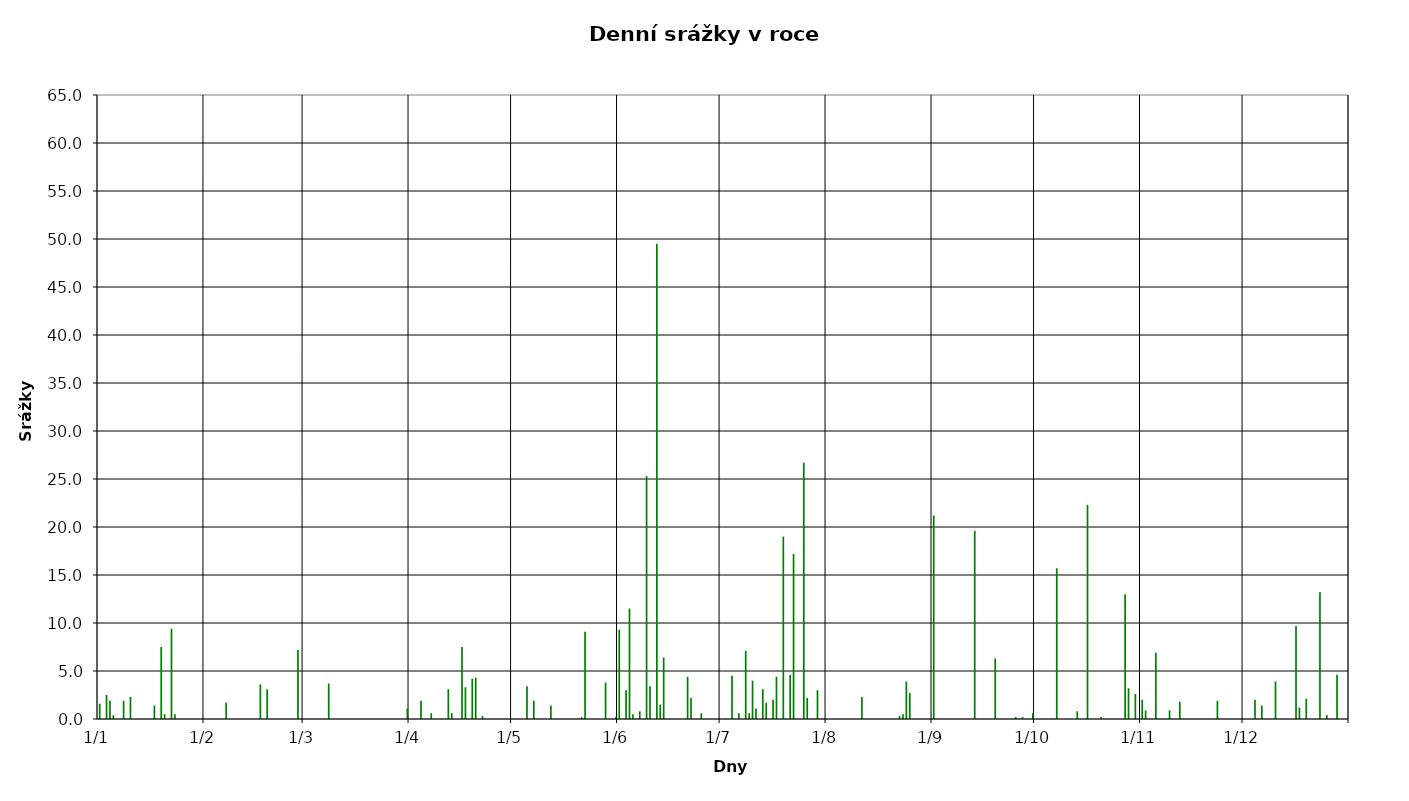
| Category | Series 0 |
|---|---|
| 2012-01-01 | 1.6 |
| 2012-01-02 | 0 |
| 2012-01-03 | 2.5 |
| 2012-01-04 | 1.9 |
| 2012-01-05 | 0.4 |
| 2012-01-06 | 0 |
| 2012-01-07 | 0 |
| 2012-01-08 | 1.9 |
| 2012-01-09 | 0 |
| 2012-01-10 | 2.3 |
| 2012-01-11 | 0 |
| 2012-01-12 | 0 |
| 2012-01-13 | 0 |
| 2012-01-14 | 0 |
| 2012-01-15 | 0 |
| 2012-01-16 | 0 |
| 2012-01-17 | 1.4 |
| 2012-01-18 | 0 |
| 2012-01-19 | 7.5 |
| 2012-01-20 | 0.5 |
| 2012-01-21 | 0 |
| 2012-01-22 | 9.4 |
| 2012-01-23 | 0.5 |
| 2012-01-24 | 0 |
| 2012-01-25 | 0 |
| 2012-01-26 | 0 |
| 2012-01-27 | 0 |
| 2012-01-28 | 0 |
| 2012-01-29 | 0 |
| 2012-01-30 | 0 |
| 2012-01-31 | 0 |
| 2012-02-01 | 0 |
| 2012-02-02 | 0 |
| 2012-02-03 | 0 |
| 2012-02-04 | 0 |
| 2012-02-05 | 0 |
| 2012-02-06 | 0 |
| 2012-02-07 | 1.7 |
| 2012-02-08 | 0 |
| 2012-02-09 | 0 |
| 2012-02-10 | 0 |
| 2012-02-11 | 0 |
| 2012-02-12 | 0 |
| 2012-02-13 | 0 |
| 2012-02-14 | 0 |
| 2012-02-15 | 0 |
| 2012-02-16 | 0 |
| 2012-02-17 | 3.6 |
| 2012-02-18 | 0 |
| 2012-02-19 | 3.1 |
| 2012-02-20 | 0 |
| 2012-02-21 | 0 |
| 2012-02-22 | 0 |
| 2012-02-23 | 0 |
| 2012-02-24 | 0 |
| 2012-02-25 | 0 |
| 2012-02-26 | 0 |
| 2012-02-27 | 0 |
| 2012-02-28 | 7.2 |
| 2012-02-29 | 0 |
| 2012-03-01 | 0 |
| 2012-03-02 | 0 |
| 2012-03-03 | 0 |
| 2012-03-04 | 0 |
| 2012-03-05 | 0 |
| 2012-03-06 | 0 |
| 2012-03-07 | 0 |
| 2012-03-08 | 3.7 |
| 2012-03-09 | 0 |
| 2012-03-10 | 0 |
| 2012-03-11 | 0 |
| 2012-03-12 | 0 |
| 2012-03-13 | 0 |
| 2012-03-14 | 0 |
| 2012-03-15 | 0 |
| 2012-03-16 | 0 |
| 2012-03-17 | 0 |
| 2012-03-18 | 0 |
| 2012-03-19 | 0 |
| 2012-03-20 | 0 |
| 2012-03-21 | 0 |
| 2012-03-22 | 0 |
| 2012-03-23 | 0 |
| 2012-03-24 | 0 |
| 2012-03-25 | 0 |
| 2012-03-26 | 0 |
| 2012-03-27 | 0 |
| 2012-03-28 | 0 |
| 2012-03-29 | 0 |
| 2012-03-30 | 0 |
| 2012-03-31 | 1.1 |
| 2012-04-01 | 0 |
| 2012-04-02 | 0 |
| 2012-04-03 | 0 |
| 2012-04-04 | 1.9 |
| 2012-04-05 | 0 |
| 2012-04-06 | 0 |
| 2012-04-07 | 0.6 |
| 2012-04-08 | 0 |
| 2012-04-09 | 0 |
| 2012-04-10 | 0 |
| 2012-04-11 | 0 |
| 2012-04-12 | 3.1 |
| 2012-04-13 | 0.6 |
| 2012-04-14 | 0 |
| 2012-04-15 | 0 |
| 2012-04-16 | 7.5 |
| 2012-04-17 | 3.3 |
| 2012-04-18 | 0 |
| 2012-04-19 | 4.2 |
| 2012-04-20 | 4.3 |
| 2012-04-21 | 0 |
| 2012-04-22 | 0.3 |
| 2012-04-23 | 0 |
| 2012-04-24 | 0 |
| 2012-04-25 | 0 |
| 2012-04-26 | 0 |
| 2012-04-27 | 0 |
| 2012-04-28 | 0 |
| 2012-04-29 | 0 |
| 2012-04-30 | 0 |
| 2012-05-01 | 0 |
| 2012-05-02 | 0 |
| 2012-05-03 | 0 |
| 2012-05-04 | 0 |
| 2012-05-05 | 3.4 |
| 2012-05-06 | 0 |
| 2012-05-07 | 1.9 |
| 2012-05-08 | 0 |
| 2012-05-09 | 0 |
| 2012-05-10 | 0 |
| 2012-05-11 | 0 |
| 2012-05-12 | 1.4 |
| 2012-05-13 | 0 |
| 2012-05-14 | 0 |
| 2012-05-15 | 0 |
| 2012-05-16 | 0 |
| 2012-05-17 | 0 |
| 2012-05-18 | 0 |
| 2012-05-19 | 0 |
| 2012-05-20 | 0 |
| 2012-05-21 | 0.2 |
| 2012-05-22 | 9.1 |
| 2012-05-23 | 0 |
| 2012-05-24 | 0 |
| 2012-05-25 | 0 |
| 2012-05-26 | 0 |
| 2012-05-27 | 0 |
| 2012-05-28 | 3.8 |
| 2012-05-29 | 0 |
| 2012-05-30 | 0 |
| 2012-05-31 | 0.2 |
| 2012-06-01 | 9.3 |
| 2012-06-02 | 0 |
| 2012-06-03 | 3 |
| 2012-06-04 | 11.5 |
| 2012-06-05 | 0.5 |
| 2012-06-06 | 0 |
| 2012-06-07 | 0.8 |
| 2012-06-08 | 0 |
| 2012-06-09 | 25.3 |
| 2012-06-10 | 3.4 |
| 2012-06-11 | 0 |
| 2012-06-12 | 49.5 |
| 2012-06-13 | 1.5 |
| 2012-06-14 | 6.4 |
| 2012-06-15 | 0 |
| 2012-06-16 | 0 |
| 2012-06-17 | 0 |
| 2012-06-18 | 0 |
| 2012-06-19 | 0 |
| 2012-06-20 | 0 |
| 2012-06-21 | 4.4 |
| 2012-06-22 | 2.2 |
| 2012-06-23 | 0 |
| 2012-06-24 | 0 |
| 2012-06-25 | 0.6 |
| 2012-06-26 | 0 |
| 2012-06-27 | 0 |
| 2012-06-28 | 0 |
| 2012-06-29 | 0 |
| 2012-06-30 | 0 |
| 2012-07-01 | 0 |
| 2012-07-02 | 0 |
| 2012-07-03 | 0 |
| 2012-07-04 | 4.5 |
| 2012-07-05 | 0 |
| 2012-07-06 | 0.6 |
| 2012-07-07 | 0 |
| 2012-07-08 | 7.1 |
| 2012-07-09 | 0.6 |
| 2012-07-10 | 4 |
| 2012-07-11 | 1.1 |
| 2012-07-12 | 0 |
| 2012-07-13 | 3.1 |
| 2012-07-14 | 1.7 |
| 2012-07-15 | 0 |
| 2012-07-16 | 2 |
| 2012-07-17 | 4.4 |
| 2012-07-18 | 0 |
| 2012-07-19 | 19 |
| 2012-07-20 | 0 |
| 2012-07-21 | 4.6 |
| 2012-07-22 | 17.2 |
| 2012-07-23 | 0 |
| 2012-07-24 | 0 |
| 2012-07-25 | 26.7 |
| 2012-07-26 | 2.2 |
| 2012-07-27 | 0 |
| 2012-07-28 | 0 |
| 2012-07-29 | 3 |
| 2012-07-30 | 0 |
| 2012-07-31 | 0 |
| 2012-08-01 | 0 |
| 2012-08-02 | 0 |
| 2012-08-03 | 0 |
| 2012-08-04 | 0 |
| 2012-08-05 | 0 |
| 2012-08-06 | 0 |
| 2012-08-07 | 0 |
| 2012-08-08 | 0 |
| 2012-08-09 | 0 |
| 2012-08-10 | 0 |
| 2012-08-11 | 2.3 |
| 2012-08-12 | 0 |
| 2012-08-13 | 0 |
| 2012-08-14 | 0 |
| 2012-08-15 | 0 |
| 2012-08-16 | 0 |
| 2012-08-17 | 0 |
| 2012-08-18 | 0 |
| 2012-08-19 | 0 |
| 2012-08-20 | 0 |
| 2012-08-21 | 0 |
| 2012-08-22 | 0.3 |
| 2012-08-23 | 0.5 |
| 2012-08-24 | 3.9 |
| 2012-08-25 | 2.7 |
| 2012-08-26 | 0 |
| 2012-08-27 | 0 |
| 2012-08-28 | 0 |
| 2012-08-29 | 0 |
| 2012-08-30 | 0 |
| 2012-08-31 | 0 |
| 2012-09-01 | 21.2 |
| 2012-09-02 | 0 |
| 2012-09-03 | 0 |
| 2012-09-04 | 0 |
| 2012-09-05 | 0 |
| 2012-09-06 | 0 |
| 2012-09-07 | 0 |
| 2012-09-08 | 0 |
| 2012-09-09 | 0 |
| 2012-09-10 | 0 |
| 2012-09-11 | 0 |
| 2012-09-12 | 0 |
| 2012-09-13 | 19.6 |
| 2012-09-14 | 0 |
| 2012-09-15 | 0 |
| 2012-09-16 | 0 |
| 2012-09-17 | 0 |
| 2012-09-18 | 0 |
| 2012-09-19 | 6.3 |
| 2012-09-20 | 0 |
| 2012-09-21 | 0 |
| 2012-09-22 | 0 |
| 2012-09-23 | 0 |
| 2012-09-24 | 0 |
| 2012-09-25 | 0.2 |
| 2012-09-26 | 0 |
| 2012-09-27 | 0.2 |
| 2012-09-28 | 0 |
| 2012-09-29 | 0 |
| 2012-09-30 | 0.6 |
| 2012-10-01 | 0 |
| 2012-10-02 | 0 |
| 2012-10-03 | 0 |
| 2012-10-04 | 0 |
| 2012-10-05 | 0 |
| 2012-10-06 | 0 |
| 2012-10-07 | 15.7 |
| 2012-10-08 | 0 |
| 2012-10-09 | 0 |
| 2012-10-10 | 0 |
| 2012-10-11 | 0 |
| 2012-10-12 | 0 |
| 2012-10-13 | 0.8 |
| 2012-10-14 | 0 |
| 2012-10-15 | 0 |
| 2012-10-16 | 22.3 |
| 2012-10-17 | 0 |
| 2012-10-18 | 0 |
| 2012-10-19 | 0 |
| 2012-10-20 | 0.2 |
| 2012-10-21 | 0 |
| 2012-10-22 | 0 |
| 2012-10-23 | 0 |
| 2012-10-24 | 0 |
| 2012-10-25 | 0 |
| 2012-10-26 | 0 |
| 2012-10-27 | 13 |
| 2012-10-28 | 3.2 |
| 2012-10-29 | 0 |
| 2012-10-30 | 2.6 |
| 2012-10-31 | 0 |
| 2012-11-01 | 2 |
| 2012-11-02 | 0.9 |
| 2012-11-03 | 0 |
| 2012-11-04 | 0 |
| 2012-11-05 | 6.9 |
| 2012-11-06 | 0 |
| 2012-11-07 | 0 |
| 2012-11-08 | 0 |
| 2012-11-09 | 0.9 |
| 2012-11-10 | 0 |
| 2012-11-11 | 0 |
| 2012-11-12 | 1.8 |
| 2012-11-13 | 0 |
| 2012-11-14 | 0 |
| 2012-11-15 | 0 |
| 2012-11-16 | 0 |
| 2012-11-17 | 0 |
| 2012-11-18 | 0 |
| 2012-11-19 | 0 |
| 2012-11-20 | 0 |
| 2012-11-21 | 0 |
| 2012-11-22 | 0 |
| 2012-11-23 | 1.9 |
| 2012-11-24 | 0 |
| 2012-11-25 | 0 |
| 2012-11-26 | 0 |
| 2012-11-27 | 0 |
| 2012-11-28 | 0 |
| 2012-11-29 | 0 |
| 2012-11-30 | 0 |
| 2012-12-01 | 0 |
| 2012-12-02 | 0 |
| 2012-12-03 | 0 |
| 2012-12-04 | 2 |
| 2012-12-05 | 0 |
| 2012-12-06 | 1.4 |
| 2012-12-07 | 0 |
| 2012-12-08 | 0 |
| 2012-12-09 | 0 |
| 2012-12-10 | 3.9 |
| 2012-12-11 | 0 |
| 2012-12-12 | 0 |
| 2012-12-13 | 0 |
| 2012-12-14 | 0 |
| 2012-12-15 | 0 |
| 2012-12-16 | 9.7 |
| 2012-12-17 | 1.2 |
| 2012-12-18 | 0 |
| 2012-12-19 | 2.1 |
| 2012-12-20 | 0 |
| 2012-12-21 | 0 |
| 2012-12-22 | 0 |
| 2012-12-23 | 13.2 |
| 2012-12-24 | 0 |
| 2012-12-25 | 0.4 |
| 2012-12-26 | 0 |
| 2012-12-27 | 0 |
| 2012-12-28 | 4.6 |
| 2012-12-29 | 0 |
| 2012-12-30 | 0 |